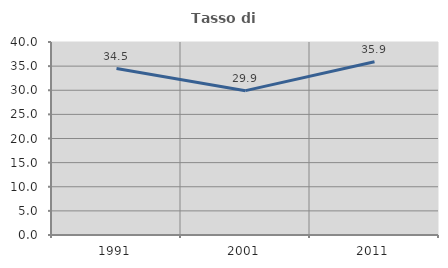
| Category | Tasso di occupazione   |
|---|---|
| 1991.0 | 34.491 |
| 2001.0 | 29.916 |
| 2011.0 | 35.919 |